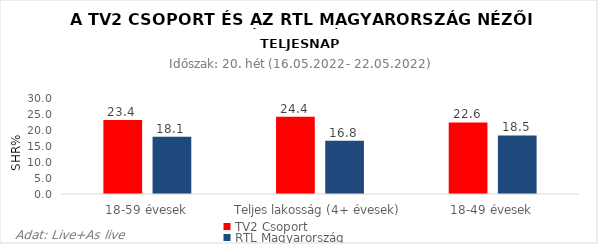
| Category | TV2 Csoport | RTL Magyarország |
|---|---|---|
| 18-59 évesek | 23.4 | 18.1 |
| Teljes lakosság (4+ évesek) | 24.4 | 16.8 |
| 18-49 évesek | 22.6 | 18.5 |